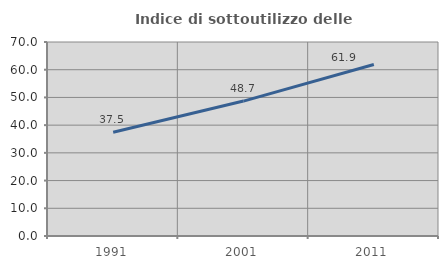
| Category | Indice di sottoutilizzo delle abitazioni  |
|---|---|
| 1991.0 | 37.452 |
| 2001.0 | 48.684 |
| 2011.0 | 61.905 |